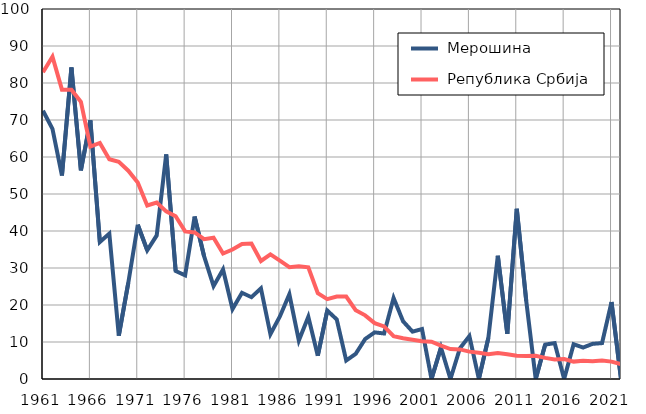
| Category |  Мерошина |  Република Србија |
|---|---|---|
| 1961.0 | 72.5 | 82.9 |
| 1962.0 | 67.6 | 87.1 |
| 1963.0 | 55 | 78.2 |
| 1964.0 | 84.2 | 78.2 |
| 1965.0 | 56.4 | 74.9 |
| 1966.0 | 69.9 | 62.8 |
| 1967.0 | 37 | 63.8 |
| 1968.0 | 39.3 | 59.4 |
| 1969.0 | 11.7 | 58.7 |
| 1970.0 | 26 | 56.3 |
| 1971.0 | 41.7 | 53.1 |
| 1972.0 | 34.8 | 46.9 |
| 1973.0 | 38.8 | 47.7 |
| 1974.0 | 60.7 | 45.3 |
| 1975.0 | 29.2 | 44 |
| 1976.0 | 28 | 39.9 |
| 1977.0 | 43.9 | 39.6 |
| 1978.0 | 33.2 | 37.8 |
| 1979.0 | 25.1 | 38.2 |
| 1980.0 | 29.6 | 33.9 |
| 1981.0 | 18.9 | 35 |
| 1982.0 | 23.3 | 36.5 |
| 1983.0 | 22.1 | 36.6 |
| 1984.0 | 24.5 | 31.9 |
| 1985.0 | 12.1 | 33.7 |
| 1986.0 | 16.9 | 32 |
| 1987.0 | 22.9 | 30.2 |
| 1988.0 | 10.4 | 30.5 |
| 1989.0 | 16.8 | 30.2 |
| 1990.0 | 6.3 | 23.2 |
| 1991.0 | 18.5 | 21.6 |
| 1992.0 | 16.1 | 22.3 |
| 1993.0 | 5 | 22.3 |
| 1994.0 | 6.8 | 18.6 |
| 1995.0 | 10.8 | 17.2 |
| 1996.0 | 12.6 | 15.1 |
| 1997.0 | 12.3 | 14.2 |
| 1998.0 | 21.9 | 11.6 |
| 1999.0 | 15.6 | 11 |
| 2000.0 | 12.8 | 10.6 |
| 2001.0 | 13.5 | 10.2 |
| 2002.0 | 0 | 10.1 |
| 2003.0 | 8.5 | 9 |
| 2004.0 | 0 | 8.1 |
| 2005.0 | 8.3 | 8 |
| 2006.0 | 11.6 | 7.4 |
| 2007.0 | 0 | 7.1 |
| 2008.0 | 11.1 | 6.7 |
| 2009.0 | 33.3 | 7 |
| 2010.0 | 12.2 | 6.7 |
| 2011.0 | 46 | 6.3 |
| 2012.0 | 21.1 | 6.2 |
| 2013.0 | 0 | 6.3 |
| 2014.0 | 9.3 | 5.7 |
| 2015.0 | 9.7 | 5.3 |
| 2016.0 | 0 | 5.4 |
| 2017.0 | 9.4 | 4.7 |
| 2018.0 | 8.5 | 4.9 |
| 2019.0 | 9.5 | 4.8 |
| 2020.0 | 9.7 | 5 |
| 2021.0 | 20.8 | 4.7 |
| 2022.0 | 0 | 4 |